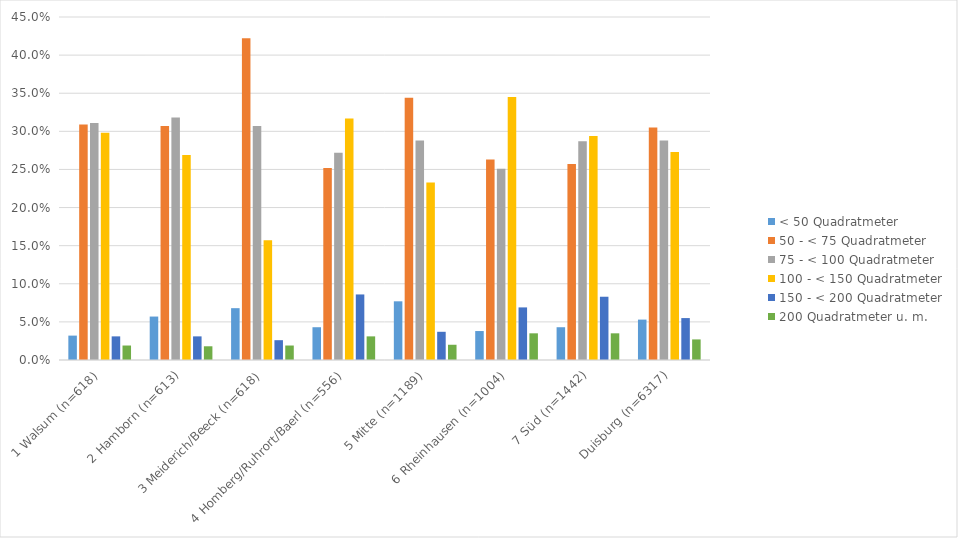
| Category | < 50 Quadratmeter | 50 - < 75 Quadratmeter | 75 - < 100 Quadratmeter | 100 - < 150 Quadratmeter | 150 - < 200 Quadratmeter | 200 Quadratmeter u. m. |
|---|---|---|---|---|---|---|
| 1 Walsum (n=618) | 0.032 | 0.309 | 0.311 | 0.298 | 0.031 | 0.019 |
| 2 Hamborn (n=613) | 0.057 | 0.307 | 0.318 | 0.269 | 0.031 | 0.018 |
| 3 Meiderich/Beeck (n=618) | 0.068 | 0.422 | 0.307 | 0.157 | 0.026 | 0.019 |
| 4 Homberg/Ruhrort/Baerl (n=556) | 0.043 | 0.252 | 0.272 | 0.317 | 0.086 | 0.031 |
| 5 Mitte (n=1189) | 0.077 | 0.344 | 0.288 | 0.233 | 0.037 | 0.02 |
| 6 Rheinhausen (n=1004) | 0.038 | 0.263 | 0.251 | 0.345 | 0.069 | 0.035 |
| 7 Süd (n=1442) | 0.043 | 0.257 | 0.287 | 0.294 | 0.083 | 0.035 |
| Duisburg (n=6317) | 0.053 | 0.305 | 0.288 | 0.273 | 0.055 | 0.027 |